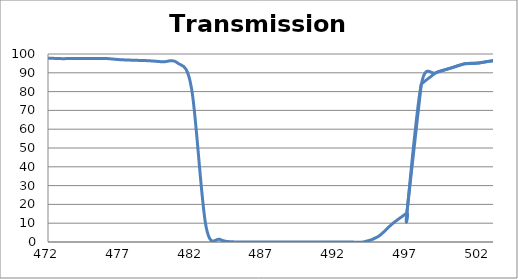
| Category | Transmission (%) |
|---|---|
| 2600.0 | 65.668 |
| 2599.0 | 65.684 |
| 2598.0 | 65.74 |
| 2597.0 | 65.794 |
| 2596.0 | 65.905 |
| 2595.0 | 66.047 |
| 2594.0 | 66.186 |
| 2593.0 | 66.374 |
| 2592.0 | 66.549 |
| 2591.0 | 66.769 |
| 2590.0 | 66.969 |
| 2589.0 | 67.181 |
| 2588.0 | 67.409 |
| 2587.0 | 67.704 |
| 2586.0 | 67.999 |
| 2585.0 | 68.207 |
| 2584.0 | 68.492 |
| 2583.0 | 68.764 |
| 2582.0 | 69.066 |
| 2581.0 | 69.389 |
| 2580.0 | 69.69 |
| 2579.0 | 69.988 |
| 2578.0 | 70.286 |
| 2577.0 | 70.584 |
| 2576.0 | 70.84 |
| 2575.0 | 71.145 |
| 2574.0 | 71.443 |
| 2573.0 | 71.683 |
| 2572.0 | 71.966 |
| 2571.0 | 72.23 |
| 2570.0 | 72.528 |
| 2569.0 | 72.798 |
| 2568.0 | 73.08 |
| 2567.0 | 73.34 |
| 2566.0 | 73.554 |
| 2565.0 | 73.762 |
| 2564.0 | 73.942 |
| 2563.0 | 74.112 |
| 2562.0 | 74.261 |
| 2561.0 | 74.375 |
| 2560.0 | 74.443 |
| 2559.0 | 74.502 |
| 2558.0 | 74.571 |
| 2557.0 | 74.596 |
| 2556.0 | 74.603 |
| 2555.0 | 74.603 |
| 2554.0 | 74.546 |
| 2553.0 | 74.491 |
| 2552.0 | 74.447 |
| 2551.0 | 74.345 |
| 2550.0 | 74.24 |
| 2549.0 | 74.157 |
| 2548.0 | 74.02 |
| 2547.0 | 73.843 |
| 2546.0 | 73.702 |
| 2545.0 | 73.576 |
| 2544.0 | 73.45 |
| 2543.0 | 73.312 |
| 2542.0 | 73.132 |
| 2541.0 | 72.984 |
| 2540.0 | 72.856 |
| 2539.0 | 72.773 |
| 2538.0 | 72.678 |
| 2537.0 | 72.597 |
| 2536.0 | 72.52 |
| 2535.0 | 72.45 |
| 2534.0 | 72.405 |
| 2533.0 | 72.385 |
| 2532.0 | 72.358 |
| 2531.0 | 72.353 |
| 2530.0 | 72.377 |
| 2529.0 | 72.429 |
| 2528.0 | 72.501 |
| 2527.0 | 72.619 |
| 2526.0 | 72.739 |
| 2525.0 | 72.878 |
| 2524.0 | 72.994 |
| 2523.0 | 73.16 |
| 2522.0 | 73.359 |
| 2521.0 | 73.58 |
| 2520.0 | 73.802 |
| 2519.0 | 74.068 |
| 2518.0 | 74.348 |
| 2517.0 | 74.641 |
| 2516.0 | 74.943 |
| 2515.0 | 75.262 |
| 2514.0 | 75.579 |
| 2513.0 | 75.898 |
| 2512.0 | 76.214 |
| 2511.0 | 76.527 |
| 2510.0 | 76.812 |
| 2509.0 | 77.129 |
| 2508.0 | 77.443 |
| 2507.0 | 77.738 |
| 2506.0 | 78.048 |
| 2505.0 | 78.302 |
| 2504.0 | 78.562 |
| 2503.0 | 78.792 |
| 2502.0 | 79.015 |
| 2501.0 | 79.195 |
| 2500.0 | 79.356 |
| 2499.0 | 79.455 |
| 2498.0 | 79.515 |
| 2497.0 | 79.581 |
| 2496.0 | 79.594 |
| 2495.0 | 79.607 |
| 2494.0 | 79.561 |
| 2493.0 | 79.493 |
| 2492.0 | 79.401 |
| 2491.0 | 79.265 |
| 2490.0 | 79.1 |
| 2489.0 | 78.941 |
| 2488.0 | 78.728 |
| 2487.0 | 78.483 |
| 2486.0 | 78.211 |
| 2485.0 | 77.928 |
| 2484.0 | 77.635 |
| 2483.0 | 77.314 |
| 2482.0 | 77.004 |
| 2481.0 | 76.682 |
| 2480.0 | 76.348 |
| 2479.0 | 76.006 |
| 2478.0 | 75.674 |
| 2477.0 | 75.333 |
| 2476.0 | 75.038 |
| 2475.0 | 74.734 |
| 2474.0 | 74.424 |
| 2473.0 | 74.117 |
| 2472.0 | 73.839 |
| 2471.0 | 73.573 |
| 2470.0 | 73.337 |
| 2469.0 | 73.155 |
| 2468.0 | 73.011 |
| 2467.0 | 72.866 |
| 2466.0 | 72.741 |
| 2465.0 | 72.637 |
| 2464.0 | 72.578 |
| 2463.0 | 72.577 |
| 2462.0 | 72.591 |
| 2461.0 | 72.631 |
| 2460.0 | 72.699 |
| 2459.0 | 72.811 |
| 2458.0 | 72.94 |
| 2457.0 | 73.11 |
| 2456.0 | 73.313 |
| 2455.0 | 73.518 |
| 2454.0 | 73.745 |
| 2453.0 | 74.009 |
| 2452.0 | 74.286 |
| 2451.0 | 74.601 |
| 2450.0 | 74.939 |
| 2449.0 | 75.282 |
| 2448.0 | 75.632 |
| 2447.0 | 75.988 |
| 2446.0 | 76.345 |
| 2445.0 | 76.72 |
| 2444.0 | 77.119 |
| 2443.0 | 77.505 |
| 2442.0 | 77.866 |
| 2441.0 | 78.23 |
| 2440.0 | 78.582 |
| 2439.0 | 78.904 |
| 2438.0 | 79.225 |
| 2437.0 | 79.519 |
| 2436.0 | 79.781 |
| 2435.0 | 80.007 |
| 2434.0 | 80.189 |
| 2433.0 | 80.339 |
| 2432.0 | 80.444 |
| 2431.0 | 80.52 |
| 2430.0 | 80.565 |
| 2429.0 | 80.544 |
| 2428.0 | 80.47 |
| 2427.0 | 80.347 |
| 2426.0 | 80.187 |
| 2425.0 | 80.012 |
| 2424.0 | 79.811 |
| 2423.0 | 79.557 |
| 2422.0 | 79.254 |
| 2421.0 | 78.933 |
| 2420.0 | 78.587 |
| 2419.0 | 78.217 |
| 2418.0 | 77.843 |
| 2417.0 | 77.45 |
| 2416.0 | 77.058 |
| 2415.0 | 76.661 |
| 2414.0 | 76.23 |
| 2413.0 | 75.806 |
| 2412.0 | 75.399 |
| 2411.0 | 75.019 |
| 2410.0 | 74.673 |
| 2409.0 | 74.315 |
| 2408.0 | 73.938 |
| 2407.0 | 73.595 |
| 2406.0 | 73.277 |
| 2405.0 | 72.981 |
| 2404.0 | 72.727 |
| 2403.0 | 72.512 |
| 2402.0 | 72.314 |
| 2401.0 | 72.12 |
| 2400.0 | 71.966 |
| 2399.0 | 71.87 |
| 2398.0 | 71.815 |
| 2397.0 | 71.79 |
| 2396.0 | 71.794 |
| 2395.0 | 71.832 |
| 2394.0 | 71.901 |
| 2393.0 | 72.006 |
| 2392.0 | 72.142 |
| 2391.0 | 72.322 |
| 2390.0 | 72.545 |
| 2389.0 | 72.805 |
| 2388.0 | 73.093 |
| 2387.0 | 73.394 |
| 2386.0 | 73.706 |
| 2385.0 | 74.043 |
| 2384.0 | 74.412 |
| 2383.0 | 74.787 |
| 2382.0 | 75.164 |
| 2381.0 | 75.565 |
| 2380.0 | 75.962 |
| 2379.0 | 76.368 |
| 2378.0 | 76.778 |
| 2377.0 | 77.186 |
| 2376.0 | 77.571 |
| 2375.0 | 77.932 |
| 2374.0 | 78.286 |
| 2373.0 | 78.638 |
| 2372.0 | 78.973 |
| 2371.0 | 79.287 |
| 2370.0 | 79.522 |
| 2369.0 | 79.723 |
| 2368.0 | 79.909 |
| 2367.0 | 80.077 |
| 2366.0 | 80.215 |
| 2365.0 | 80.334 |
| 2364.0 | 80.411 |
| 2363.0 | 80.437 |
| 2362.0 | 80.417 |
| 2361.0 | 80.37 |
| 2360.0 | 80.287 |
| 2359.0 | 80.184 |
| 2358.0 | 80.058 |
| 2357.0 | 79.887 |
| 2356.0 | 79.696 |
| 2355.0 | 79.484 |
| 2354.0 | 79.221 |
| 2353.0 | 78.97 |
| 2352.0 | 78.721 |
| 2351.0 | 78.455 |
| 2350.0 | 78.184 |
| 2349.0 | 77.905 |
| 2348.0 | 77.635 |
| 2347.0 | 77.384 |
| 2346.0 | 77.136 |
| 2345.0 | 76.896 |
| 2344.0 | 76.677 |
| 2343.0 | 76.468 |
| 2342.0 | 76.282 |
| 2341.0 | 76.125 |
| 2340.0 | 75.978 |
| 2339.0 | 75.867 |
| 2338.0 | 75.777 |
| 2337.0 | 75.701 |
| 2336.0 | 75.665 |
| 2335.0 | 75.641 |
| 2334.0 | 75.666 |
| 2333.0 | 75.715 |
| 2332.0 | 75.801 |
| 2331.0 | 75.889 |
| 2330.0 | 75.966 |
| 2329.0 | 76.085 |
| 2328.0 | 76.218 |
| 2327.0 | 76.397 |
| 2326.0 | 76.617 |
| 2325.0 | 76.819 |
| 2324.0 | 77.015 |
| 2323.0 | 77.222 |
| 2322.0 | 77.435 |
| 2321.0 | 77.662 |
| 2320.0 | 77.899 |
| 2319.0 | 78.158 |
| 2318.0 | 78.41 |
| 2317.0 | 78.622 |
| 2316.0 | 78.823 |
| 2315.0 | 78.999 |
| 2314.0 | 79.189 |
| 2313.0 | 79.346 |
| 2312.0 | 79.484 |
| 2311.0 | 79.628 |
| 2310.0 | 79.697 |
| 2309.0 | 79.741 |
| 2308.0 | 79.75 |
| 2307.0 | 79.758 |
| 2306.0 | 79.759 |
| 2305.0 | 79.703 |
| 2304.0 | 79.613 |
| 2303.0 | 79.542 |
| 2302.0 | 79.419 |
| 2301.0 | 79.265 |
| 2300.0 | 79.082 |
| 2299.0 | 78.914 |
| 2298.0 | 78.705 |
| 2297.0 | 78.472 |
| 2296.0 | 78.245 |
| 2295.0 | 78.013 |
| 2294.0 | 77.78 |
| 2293.0 | 77.56 |
| 2292.0 | 77.332 |
| 2291.0 | 77.077 |
| 2290.0 | 76.838 |
| 2289.0 | 76.574 |
| 2288.0 | 76.349 |
| 2287.0 | 76.118 |
| 2286.0 | 75.925 |
| 2285.0 | 75.739 |
| 2284.0 | 75.55 |
| 2283.0 | 75.338 |
| 2282.0 | 75.189 |
| 2281.0 | 75.037 |
| 2280.0 | 74.928 |
| 2279.0 | 74.804 |
| 2278.0 | 74.702 |
| 2277.0 | 74.629 |
| 2276.0 | 74.57 |
| 2275.0 | 74.517 |
| 2274.0 | 74.481 |
| 2273.0 | 74.467 |
| 2272.0 | 74.471 |
| 2271.0 | 74.454 |
| 2270.0 | 74.495 |
| 2269.0 | 74.492 |
| 2268.0 | 74.524 |
| 2267.0 | 74.583 |
| 2266.0 | 74.66 |
| 2265.0 | 74.712 |
| 2264.0 | 74.754 |
| 2263.0 | 74.83 |
| 2262.0 | 74.857 |
| 2261.0 | 74.913 |
| 2260.0 | 74.949 |
| 2259.0 | 74.973 |
| 2258.0 | 75.001 |
| 2257.0 | 75.016 |
| 2256.0 | 75.018 |
| 2255.0 | 75.04 |
| 2254.0 | 75.052 |
| 2253.0 | 75.081 |
| 2252.0 | 75.09 |
| 2251.0 | 75.042 |
| 2250.0 | 75.02 |
| 2249.0 | 74.996 |
| 2248.0 | 74.967 |
| 2247.0 | 74.963 |
| 2246.0 | 74.947 |
| 2245.0 | 74.889 |
| 2244.0 | 74.808 |
| 2243.0 | 74.766 |
| 2242.0 | 74.719 |
| 2241.0 | 74.674 |
| 2240.0 | 74.61 |
| 2239.0 | 74.554 |
| 2238.0 | 74.479 |
| 2237.0 | 74.382 |
| 2236.0 | 74.31 |
| 2235.0 | 74.235 |
| 2234.0 | 74.141 |
| 2233.0 | 74.039 |
| 2232.0 | 73.905 |
| 2231.0 | 73.759 |
| 2230.0 | 73.624 |
| 2229.0 | 73.452 |
| 2228.0 | 73.281 |
| 2227.0 | 73.106 |
| 2226.0 | 72.911 |
| 2225.0 | 72.695 |
| 2224.0 | 72.451 |
| 2223.0 | 72.182 |
| 2222.0 | 71.929 |
| 2221.0 | 71.682 |
| 2220.0 | 71.411 |
| 2219.0 | 71.13 |
| 2218.0 | 70.876 |
| 2217.0 | 70.608 |
| 2216.0 | 70.393 |
| 2215.0 | 70.158 |
| 2214.0 | 69.957 |
| 2213.0 | 69.779 |
| 2212.0 | 69.646 |
| 2211.0 | 69.523 |
| 2210.0 | 69.44 |
| 2209.0 | 69.437 |
| 2208.0 | 69.509 |
| 2207.0 | 69.62 |
| 2206.0 | 69.799 |
| 2205.0 | 70.027 |
| 2204.0 | 70.287 |
| 2203.0 | 70.636 |
| 2202.0 | 71.03 |
| 2201.0 | 71.459 |
| 2200.0 | 71.949 |
| 2199.0 | 72.453 |
| 2198.0 | 72.921 |
| 2197.0 | 73.437 |
| 2196.0 | 73.984 |
| 2195.0 | 74.483 |
| 2194.0 | 74.942 |
| 2193.0 | 75.407 |
| 2192.0 | 75.798 |
| 2191.0 | 76.24 |
| 2190.0 | 76.62 |
| 2189.0 | 77.04 |
| 2188.0 | 77.394 |
| 2187.0 | 77.769 |
| 2186.0 | 78.088 |
| 2185.0 | 78.403 |
| 2184.0 | 78.724 |
| 2183.0 | 79.033 |
| 2182.0 | 79.329 |
| 2181.0 | 79.635 |
| 2180.0 | 79.872 |
| 2179.0 | 80.127 |
| 2178.0 | 80.356 |
| 2177.0 | 80.603 |
| 2176.0 | 80.773 |
| 2175.0 | 80.943 |
| 2174.0 | 81.101 |
| 2173.0 | 81.223 |
| 2172.0 | 81.293 |
| 2171.0 | 81.336 |
| 2170.0 | 81.362 |
| 2169.0 | 81.354 |
| 2168.0 | 81.332 |
| 2167.0 | 81.277 |
| 2166.0 | 81.142 |
| 2165.0 | 80.98 |
| 2164.0 | 80.777 |
| 2163.0 | 80.548 |
| 2162.0 | 80.275 |
| 2161.0 | 79.961 |
| 2160.0 | 79.627 |
| 2159.0 | 79.245 |
| 2158.0 | 78.893 |
| 2157.0 | 78.51 |
| 2156.0 | 78.103 |
| 2155.0 | 77.69 |
| 2154.0 | 77.241 |
| 2153.0 | 76.831 |
| 2152.0 | 76.452 |
| 2151.0 | 76.052 |
| 2150.0 | 75.695 |
| 2149.0 | 75.327 |
| 2148.0 | 75.031 |
| 2147.0 | 74.747 |
| 2146.0 | 74.483 |
| 2145.0 | 74.26 |
| 2144.0 | 74.089 |
| 2143.0 | 73.972 |
| 2142.0 | 73.845 |
| 2141.0 | 73.766 |
| 2140.0 | 73.753 |
| 2139.0 | 73.754 |
| 2138.0 | 73.834 |
| 2137.0 | 73.928 |
| 2136.0 | 74.047 |
| 2135.0 | 74.218 |
| 2134.0 | 74.427 |
| 2133.0 | 74.636 |
| 2132.0 | 74.886 |
| 2131.0 | 75.17 |
| 2130.0 | 75.484 |
| 2129.0 | 75.755 |
| 2128.0 | 76.033 |
| 2127.0 | 76.312 |
| 2126.0 | 76.631 |
| 2125.0 | 76.982 |
| 2124.0 | 77.257 |
| 2123.0 | 77.508 |
| 2122.0 | 77.75 |
| 2121.0 | 77.967 |
| 2120.0 | 78.139 |
| 2119.0 | 78.25 |
| 2118.0 | 78.327 |
| 2117.0 | 78.381 |
| 2116.0 | 78.333 |
| 2115.0 | 78.265 |
| 2114.0 | 78.133 |
| 2113.0 | 77.955 |
| 2112.0 | 77.753 |
| 2111.0 | 77.489 |
| 2110.0 | 77.206 |
| 2109.0 | 76.863 |
| 2108.0 | 76.499 |
| 2107.0 | 76.132 |
| 2106.0 | 75.786 |
| 2105.0 | 75.396 |
| 2104.0 | 75.026 |
| 2103.0 | 74.631 |
| 2102.0 | 74.28 |
| 2101.0 | 73.951 |
| 2100.0 | 73.668 |
| 2099.0 | 73.406 |
| 2098.0 | 73.187 |
| 2097.0 | 72.988 |
| 2096.0 | 72.863 |
| 2095.0 | 72.768 |
| 2094.0 | 72.744 |
| 2093.0 | 72.778 |
| 2092.0 | 72.842 |
| 2091.0 | 72.946 |
| 2090.0 | 73.11 |
| 2089.0 | 73.337 |
| 2088.0 | 73.581 |
| 2087.0 | 73.88 |
| 2086.0 | 74.223 |
| 2085.0 | 74.621 |
| 2084.0 | 75.032 |
| 2083.0 | 75.495 |
| 2082.0 | 75.916 |
| 2081.0 | 76.379 |
| 2080.0 | 76.861 |
| 2079.0 | 77.328 |
| 2078.0 | 77.766 |
| 2077.0 | 78.173 |
| 2076.0 | 78.551 |
| 2075.0 | 78.884 |
| 2074.0 | 79.144 |
| 2073.0 | 79.345 |
| 2072.0 | 79.482 |
| 2071.0 | 79.532 |
| 2070.0 | 79.486 |
| 2069.0 | 79.382 |
| 2068.0 | 79.182 |
| 2067.0 | 78.9 |
| 2066.0 | 78.563 |
| 2065.0 | 78.164 |
| 2064.0 | 77.702 |
| 2063.0 | 77.195 |
| 2062.0 | 76.643 |
| 2061.0 | 76.087 |
| 2060.0 | 75.527 |
| 2059.0 | 74.936 |
| 2058.0 | 74.354 |
| 2057.0 | 73.763 |
| 2056.0 | 73.213 |
| 2055.0 | 72.724 |
| 2054.0 | 72.28 |
| 2053.0 | 71.877 |
| 2052.0 | 71.514 |
| 2051.0 | 71.207 |
| 2050.0 | 70.974 |
| 2049.0 | 70.807 |
| 2048.0 | 70.706 |
| 2047.0 | 70.681 |
| 2046.0 | 70.728 |
| 2045.0 | 70.828 |
| 2044.0 | 70.99 |
| 2043.0 | 71.229 |
| 2042.0 | 71.564 |
| 2041.0 | 71.964 |
| 2040.0 | 72.373 |
| 2039.0 | 72.804 |
| 2038.0 | 73.291 |
| 2037.0 | 73.838 |
| 2036.0 | 74.394 |
| 2035.0 | 74.951 |
| 2034.0 | 75.496 |
| 2033.0 | 75.995 |
| 2032.0 | 76.455 |
| 2031.0 | 76.88 |
| 2030.0 | 77.24 |
| 2029.0 | 77.514 |
| 2028.0 | 77.678 |
| 2027.0 | 77.752 |
| 2026.0 | 77.738 |
| 2025.0 | 77.61 |
| 2024.0 | 77.377 |
| 2023.0 | 77.023 |
| 2022.0 | 76.601 |
| 2021.0 | 76.101 |
| 2020.0 | 75.484 |
| 2019.0 | 74.814 |
| 2018.0 | 74.086 |
| 2017.0 | 73.353 |
| 2016.0 | 72.628 |
| 2015.0 | 71.869 |
| 2014.0 | 71.135 |
| 2013.0 | 70.429 |
| 2012.0 | 69.724 |
| 2011.0 | 69.092 |
| 2010.0 | 68.511 |
| 2009.0 | 67.971 |
| 2008.0 | 67.482 |
| 2007.0 | 67.081 |
| 2006.0 | 66.787 |
| 2005.0 | 66.577 |
| 2004.0 | 66.451 |
| 2003.0 | 66.411 |
| 2002.0 | 66.443 |
| 2001.0 | 66.57 |
| 2000.0 | 66.825 |
| 1999.0 | 67.154 |
| 1998.0 | 67.552 |
| 1997.0 | 68.035 |
| 1996.0 | 68.593 |
| 1995.0 | 69.219 |
| 1994.0 | 69.916 |
| 1993.0 | 70.61 |
| 1992.0 | 71.302 |
| 1991.0 | 72.007 |
| 1990.0 | 72.705 |
| 1989.0 | 73.356 |
| 1988.0 | 73.923 |
| 1987.0 | 74.413 |
| 1986.0 | 74.78 |
| 1985.0 | 75.044 |
| 1984.0 | 75.189 |
| 1983.0 | 75.171 |
| 1982.0 | 75.013 |
| 1981.0 | 74.716 |
| 1980.0 | 74.256 |
| 1979.0 | 73.673 |
| 1978.0 | 72.961 |
| 1977.0 | 72.16 |
| 1976.0 | 71.307 |
| 1975.0 | 70.389 |
| 1974.0 | 69.395 |
| 1973.0 | 68.4 |
| 1972.0 | 67.378 |
| 1971.0 | 66.396 |
| 1970.0 | 65.437 |
| 1969.0 | 64.462 |
| 1968.0 | 63.603 |
| 1967.0 | 62.855 |
| 1966.0 | 62.152 |
| 1965.0 | 61.512 |
| 1964.0 | 60.993 |
| 1963.0 | 60.61 |
| 1962.0 | 60.305 |
| 1961.0 | 60.127 |
| 1960.0 | 60.089 |
| 1959.0 | 60.185 |
| 1958.0 | 60.365 |
| 1957.0 | 60.717 |
| 1956.0 | 61.168 |
| 1955.0 | 61.759 |
| 1954.0 | 62.504 |
| 1953.0 | 63.325 |
| 1952.0 | 64.228 |
| 1951.0 | 65.226 |
| 1950.0 | 66.382 |
| 1949.0 | 67.595 |
| 1948.0 | 68.763 |
| 1947.0 | 70.041 |
| 1946.0 | 71.328 |
| 1945.0 | 72.52 |
| 1944.0 | 73.735 |
| 1943.0 | 74.823 |
| 1942.0 | 75.745 |
| 1941.0 | 76.58 |
| 1940.0 | 77.257 |
| 1939.0 | 77.733 |
| 1938.0 | 78.002 |
| 1937.0 | 78.089 |
| 1936.0 | 78.019 |
| 1935.0 | 77.768 |
| 1934.0 | 77.332 |
| 1933.0 | 76.784 |
| 1932.0 | 76.084 |
| 1931.0 | 75.309 |
| 1930.0 | 74.48 |
| 1929.0 | 73.555 |
| 1928.0 | 72.573 |
| 1927.0 | 71.614 |
| 1926.0 | 70.672 |
| 1925.0 | 69.784 |
| 1924.0 | 69.03 |
| 1923.0 | 68.365 |
| 1922.0 | 67.773 |
| 1921.0 | 67.186 |
| 1920.0 | 66.686 |
| 1919.0 | 66.328 |
| 1918.0 | 66.101 |
| 1917.0 | 66.054 |
| 1916.0 | 66.182 |
| 1915.0 | 66.422 |
| 1914.0 | 66.701 |
| 1913.0 | 67.066 |
| 1912.0 | 67.468 |
| 1911.0 | 67.966 |
| 1910.0 | 68.59 |
| 1909.0 | 69.235 |
| 1908.0 | 69.917 |
| 1907.0 | 70.622 |
| 1906.0 | 71.406 |
| 1905.0 | 72.031 |
| 1904.0 | 72.634 |
| 1903.0 | 73.125 |
| 1902.0 | 73.596 |
| 1901.0 | 73.953 |
| 1900.0 | 74.186 |
| 1899.0 | 74.284 |
| 1898.0 | 74.216 |
| 1897.0 | 74.049 |
| 1896.0 | 73.842 |
| 1895.0 | 73.58 |
| 1894.0 | 73.238 |
| 1893.0 | 72.776 |
| 1892.0 | 72.196 |
| 1891.0 | 71.53 |
| 1890.0 | 70.83 |
| 1889.0 | 70.18 |
| 1888.0 | 69.601 |
| 1887.0 | 69.136 |
| 1886.0 | 68.728 |
| 1885.0 | 68.347 |
| 1884.0 | 68.001 |
| 1883.0 | 67.697 |
| 1882.0 | 67.556 |
| 1881.0 | 67.513 |
| 1880.0 | 67.587 |
| 1879.0 | 67.835 |
| 1878.0 | 68.161 |
| 1877.0 | 68.652 |
| 1876.0 | 69.173 |
| 1875.0 | 69.792 |
| 1874.0 | 70.5 |
| 1873.0 | 71.316 |
| 1872.0 | 72.194 |
| 1871.0 | 73.04 |
| 1870.0 | 73.936 |
| 1869.0 | 74.881 |
| 1868.0 | 75.687 |
| 1867.0 | 76.447 |
| 1866.0 | 77.036 |
| 1865.0 | 77.549 |
| 1864.0 | 77.874 |
| 1863.0 | 78.126 |
| 1862.0 | 78.17 |
| 1861.0 | 78.024 |
| 1860.0 | 77.619 |
| 1859.0 | 77.131 |
| 1858.0 | 76.512 |
| 1857.0 | 75.818 |
| 1856.0 | 75.081 |
| 1855.0 | 74.251 |
| 1854.0 | 73.433 |
| 1853.0 | 72.555 |
| 1852.0 | 71.7 |
| 1851.0 | 70.897 |
| 1850.0 | 70.329 |
| 1849.0 | 69.826 |
| 1848.0 | 69.312 |
| 1847.0 | 68.76 |
| 1846.0 | 68.371 |
| 1845.0 | 68.191 |
| 1844.0 | 68.25 |
| 1843.0 | 68.532 |
| 1842.0 | 68.973 |
| 1841.0 | 69.434 |
| 1840.0 | 70.051 |
| 1839.0 | 70.696 |
| 1838.0 | 71.469 |
| 1837.0 | 72.413 |
| 1836.0 | 73.612 |
| 1835.0 | 74.806 |
| 1834.0 | 75.888 |
| 1833.0 | 76.911 |
| 1832.0 | 77.939 |
| 1831.0 | 78.846 |
| 1830.0 | 79.611 |
| 1829.0 | 80.2 |
| 1828.0 | 80.477 |
| 1827.0 | 80.516 |
| 1826.0 | 80.303 |
| 1825.0 | 79.882 |
| 1824.0 | 79.153 |
| 1823.0 | 78.42 |
| 1822.0 | 77.413 |
| 1821.0 | 76.006 |
| 1820.0 | 74.417 |
| 1819.0 | 72.777 |
| 1818.0 | 71.307 |
| 1817.0 | 69.949 |
| 1816.0 | 68.521 |
| 1815.0 | 67.139 |
| 1814.0 | 65.847 |
| 1813.0 | 64.69 |
| 1812.0 | 63.616 |
| 1811.0 | 62.69 |
| 1810.0 | 61.85 |
| 1809.0 | 61.175 |
| 1808.0 | 60.754 |
| 1807.0 | 60.426 |
| 1806.0 | 60.236 |
| 1805.0 | 60.175 |
| 1804.0 | 60.248 |
| 1803.0 | 60.442 |
| 1802.0 | 60.755 |
| 1801.0 | 61.234 |
| 1800.0 | 61.786 |
| 1799.0 | 62.359 |
| 1798.0 | 62.982 |
| 1797.0 | 63.637 |
| 1796.0 | 64.226 |
| 1795.0 | 64.818 |
| 1794.0 | 65.339 |
| 1793.0 | 65.742 |
| 1792.0 | 66.046 |
| 1791.0 | 66.214 |
| 1790.0 | 66.214 |
| 1789.0 | 66.049 |
| 1788.0 | 65.74 |
| 1787.0 | 65.292 |
| 1786.0 | 64.747 |
| 1785.0 | 64.049 |
| 1784.0 | 63.314 |
| 1783.0 | 62.589 |
| 1782.0 | 61.814 |
| 1781.0 | 61.111 |
| 1780.0 | 60.439 |
| 1779.0 | 59.795 |
| 1778.0 | 59.25 |
| 1777.0 | 58.858 |
| 1776.0 | 58.606 |
| 1775.0 | 58.469 |
| 1774.0 | 58.502 |
| 1773.0 | 58.665 |
| 1772.0 | 58.986 |
| 1771.0 | 59.456 |
| 1770.0 | 60.1 |
| 1769.0 | 60.931 |
| 1768.0 | 61.905 |
| 1767.0 | 63.047 |
| 1766.0 | 64.348 |
| 1765.0 | 65.75 |
| 1764.0 | 67.262 |
| 1763.0 | 68.83 |
| 1762.0 | 70.424 |
| 1761.0 | 72.059 |
| 1760.0 | 73.65 |
| 1759.0 | 75.048 |
| 1758.0 | 76.316 |
| 1757.0 | 77.356 |
| 1756.0 | 78.092 |
| 1755.0 | 78.536 |
| 1754.0 | 78.682 |
| 1753.0 | 78.498 |
| 1752.0 | 78.019 |
| 1751.0 | 77.249 |
| 1750.0 | 76.276 |
| 1749.0 | 75.131 |
| 1748.0 | 73.877 |
| 1747.0 | 72.591 |
| 1746.0 | 71.284 |
| 1745.0 | 70.004 |
| 1744.0 | 68.76 |
| 1743.0 | 67.707 |
| 1742.0 | 66.763 |
| 1741.0 | 65.994 |
| 1740.0 | 65.391 |
| 1739.0 | 65.022 |
| 1738.0 | 64.773 |
| 1737.0 | 64.738 |
| 1736.0 | 64.916 |
| 1735.0 | 65.256 |
| 1734.0 | 65.772 |
| 1733.0 | 66.501 |
| 1732.0 | 67.404 |
| 1731.0 | 68.424 |
| 1730.0 | 69.666 |
| 1729.0 | 71.076 |
| 1728.0 | 72.628 |
| 1727.0 | 74.28 |
| 1726.0 | 76.017 |
| 1725.0 | 77.742 |
| 1724.0 | 79.532 |
| 1723.0 | 81.346 |
| 1722.0 | 83.107 |
| 1721.0 | 84.74 |
| 1720.0 | 86.3 |
| 1719.0 | 87.687 |
| 1718.0 | 88.922 |
| 1717.0 | 89.976 |
| 1716.0 | 90.817 |
| 1715.0 | 91.487 |
| 1714.0 | 91.993 |
| 1713.0 | 92.285 |
| 1712.0 | 92.404 |
| 1711.0 | 92.38 |
| 1710.0 | 92.208 |
| 1709.0 | 91.98 |
| 1708.0 | 91.652 |
| 1707.0 | 91.255 |
| 1706.0 | 90.823 |
| 1705.0 | 90.295 |
| 1704.0 | 89.717 |
| 1703.0 | 89.09 |
| 1702.0 | 88.41 |
| 1701.0 | 87.707 |
| 1700.0 | 86.95 |
| 1699.0 | 86.154 |
| 1698.0 | 85.308 |
| 1697.0 | 84.449 |
| 1696.0 | 83.544 |
| 1695.0 | 82.655 |
| 1694.0 | 81.807 |
| 1693.0 | 80.933 |
| 1692.0 | 80.081 |
| 1691.0 | 79.272 |
| 1690.0 | 78.526 |
| 1689.0 | 77.875 |
| 1688.0 | 77.325 |
| 1687.0 | 76.891 |
| 1686.0 | 76.591 |
| 1685.0 | 76.471 |
| 1684.0 | 76.521 |
| 1683.0 | 76.713 |
| 1682.0 | 77.12 |
| 1681.0 | 77.71 |
| 1680.0 | 78.481 |
| 1679.0 | 79.445 |
| 1678.0 | 80.588 |
| 1677.0 | 81.905 |
| 1676.0 | 83.351 |
| 1675.0 | 84.872 |
| 1674.0 | 86.44 |
| 1673.0 | 87.967 |
| 1672.0 | 89.353 |
| 1671.0 | 90.642 |
| 1670.0 | 91.721 |
| 1669.0 | 92.543 |
| 1668.0 | 93.033 |
| 1667.0 | 93.094 |
| 1666.0 | 92.807 |
| 1665.0 | 92.171 |
| 1664.0 | 91.174 |
| 1663.0 | 89.917 |
| 1662.0 | 88.474 |
| 1661.0 | 86.907 |
| 1660.0 | 85.298 |
| 1659.0 | 83.653 |
| 1658.0 | 82.041 |
| 1657.0 | 80.547 |
| 1656.0 | 79.25 |
| 1655.0 | 78.179 |
| 1654.0 | 77.28 |
| 1653.0 | 76.622 |
| 1652.0 | 76.204 |
| 1651.0 | 76.047 |
| 1650.0 | 76.169 |
| 1649.0 | 76.57 |
| 1648.0 | 77.24 |
| 1647.0 | 78.152 |
| 1646.0 | 79.264 |
| 1645.0 | 80.585 |
| 1644.0 | 82.1 |
| 1643.0 | 83.753 |
| 1642.0 | 85.474 |
| 1641.0 | 87.204 |
| 1640.0 | 88.866 |
| 1639.0 | 90.344 |
| 1638.0 | 91.559 |
| 1637.0 | 92.475 |
| 1636.0 | 93.036 |
| 1635.0 | 93.203 |
| 1634.0 | 92.979 |
| 1633.0 | 92.359 |
| 1632.0 | 91.452 |
| 1631.0 | 90.311 |
| 1630.0 | 88.966 |
| 1629.0 | 87.541 |
| 1628.0 | 86.119 |
| 1627.0 | 84.735 |
| 1626.0 | 83.45 |
| 1625.0 | 82.382 |
| 1624.0 | 81.564 |
| 1623.0 | 80.949 |
| 1622.0 | 80.568 |
| 1621.0 | 80.454 |
| 1620.0 | 80.592 |
| 1619.0 | 80.962 |
| 1618.0 | 81.542 |
| 1617.0 | 82.33 |
| 1616.0 | 83.284 |
| 1615.0 | 84.373 |
| 1614.0 | 85.475 |
| 1613.0 | 86.625 |
| 1612.0 | 87.694 |
| 1611.0 | 88.633 |
| 1610.0 | 89.434 |
| 1609.0 | 89.96 |
| 1608.0 | 90.172 |
| 1607.0 | 90.087 |
| 1606.0 | 89.722 |
| 1605.0 | 89.071 |
| 1604.0 | 88.128 |
| 1603.0 | 86.96 |
| 1602.0 | 85.646 |
| 1601.0 | 84.229 |
| 1600.0 | 82.834 |
| 1599.0 | 81.462 |
| 1598.0 | 80.177 |
| 1597.0 | 79.082 |
| 1596.0 | 78.186 |
| 1595.0 | 77.506 |
| 1594.0 | 77.059 |
| 1593.0 | 76.872 |
| 1592.0 | 76.902 |
| 1591.0 | 77.175 |
| 1590.0 | 77.693 |
| 1589.0 | 78.425 |
| 1588.0 | 79.315 |
| 1587.0 | 80.415 |
| 1586.0 | 81.497 |
| 1585.0 | 82.638 |
| 1584.0 | 83.776 |
| 1583.0 | 84.858 |
| 1582.0 | 85.848 |
| 1581.0 | 86.7 |
| 1580.0 | 87.352 |
| 1579.0 | 87.838 |
| 1578.0 | 88.117 |
| 1577.0 | 88.217 |
| 1576.0 | 88.201 |
| 1575.0 | 88.037 |
| 1574.0 | 87.763 |
| 1573.0 | 87.427 |
| 1572.0 | 87.106 |
| 1571.0 | 86.853 |
| 1570.0 | 86.665 |
| 1569.0 | 86.526 |
| 1568.0 | 86.478 |
| 1567.0 | 86.578 |
| 1566.0 | 86.784 |
| 1565.0 | 87.134 |
| 1564.0 | 87.579 |
| 1563.0 | 88.083 |
| 1562.0 | 88.63 |
| 1561.0 | 89.165 |
| 1560.0 | 89.713 |
| 1559.0 | 90.175 |
| 1558.0 | 90.524 |
| 1557.0 | 90.716 |
| 1556.0 | 90.764 |
| 1555.0 | 90.652 |
| 1554.0 | 90.382 |
| 1553.0 | 89.963 |
| 1552.0 | 89.419 |
| 1551.0 | 88.832 |
| 1550.0 | 88.186 |
| 1549.0 | 87.565 |
| 1548.0 | 87.015 |
| 1547.0 | 86.554 |
| 1546.0 | 86.222 |
| 1545.0 | 86.021 |
| 1544.0 | 85.994 |
| 1543.0 | 86.077 |
| 1542.0 | 86.283 |
| 1541.0 | 86.598 |
| 1540.0 | 86.968 |
| 1539.0 | 87.404 |
| 1538.0 | 87.806 |
| 1537.0 | 88.104 |
| 1536.0 | 88.281 |
| 1535.0 | 88.288 |
| 1534.0 | 88.09 |
| 1533.0 | 87.674 |
| 1532.0 | 87.017 |
| 1531.0 | 86.175 |
| 1530.0 | 85.158 |
| 1529.0 | 83.89 |
| 1528.0 | 82.549 |
| 1527.0 | 81.111 |
| 1526.0 | 79.773 |
| 1525.0 | 78.476 |
| 1524.0 | 77.291 |
| 1523.0 | 76.287 |
| 1522.0 | 75.509 |
| 1521.0 | 74.967 |
| 1520.0 | 74.698 |
| 1519.0 | 74.743 |
| 1518.0 | 75.056 |
| 1517.0 | 75.621 |
| 1516.0 | 76.427 |
| 1515.0 | 77.444 |
| 1514.0 | 78.628 |
| 1513.0 | 79.94 |
| 1512.0 | 81.255 |
| 1511.0 | 82.474 |
| 1510.0 | 83.544 |
| 1509.0 | 84.408 |
| 1508.0 | 84.927 |
| 1507.0 | 85.049 |
| 1506.0 | 84.847 |
| 1505.0 | 84.336 |
| 1504.0 | 83.499 |
| 1503.0 | 82.419 |
| 1502.0 | 81.186 |
| 1501.0 | 79.865 |
| 1500.0 | 78.571 |
| 1499.0 | 77.376 |
| 1498.0 | 76.332 |
| 1497.0 | 75.455 |
| 1496.0 | 74.835 |
| 1495.0 | 74.446 |
| 1494.0 | 74.333 |
| 1493.0 | 74.482 |
| 1492.0 | 74.862 |
| 1491.0 | 75.487 |
| 1490.0 | 76.293 |
| 1489.0 | 77.264 |
| 1488.0 | 78.299 |
| 1487.0 | 79.415 |
| 1486.0 | 80.517 |
| 1485.0 | 81.566 |
| 1484.0 | 82.39 |
| 1483.0 | 83.025 |
| 1482.0 | 83.372 |
| 1481.0 | 83.446 |
| 1480.0 | 83.275 |
| 1479.0 | 82.81 |
| 1478.0 | 82.21 |
| 1477.0 | 81.484 |
| 1476.0 | 80.69 |
| 1475.0 | 79.866 |
| 1474.0 | 79.123 |
| 1473.0 | 78.554 |
| 1472.0 | 78.123 |
| 1471.0 | 77.811 |
| 1470.0 | 77.649 |
| 1469.0 | 77.664 |
| 1468.0 | 77.776 |
| 1467.0 | 78.101 |
| 1466.0 | 78.434 |
| 1465.0 | 78.809 |
| 1464.0 | 79.108 |
| 1463.0 | 79.348 |
| 1462.0 | 79.505 |
| 1461.0 | 79.501 |
| 1460.0 | 79.369 |
| 1459.0 | 79.096 |
| 1458.0 | 78.683 |
| 1457.0 | 78.151 |
| 1456.0 | 77.546 |
| 1455.0 | 76.972 |
| 1454.0 | 76.392 |
| 1453.0 | 75.841 |
| 1452.0 | 75.373 |
| 1451.0 | 74.983 |
| 1450.0 | 74.686 |
| 1449.0 | 74.487 |
| 1448.0 | 74.376 |
| 1447.0 | 74.324 |
| 1446.0 | 74.358 |
| 1445.0 | 74.289 |
| 1444.0 | 74.164 |
| 1443.0 | 73.991 |
| 1442.0 | 73.686 |
| 1441.0 | 73.246 |
| 1440.0 | 72.675 |
| 1439.0 | 71.916 |
| 1438.0 | 71.109 |
| 1437.0 | 70.161 |
| 1436.0 | 69.17 |
| 1435.0 | 68.268 |
| 1434.0 | 67.447 |
| 1433.0 | 66.731 |
| 1432.0 | 66.238 |
| 1431.0 | 65.886 |
| 1430.0 | 65.775 |
| 1429.0 | 65.891 |
| 1428.0 | 66.256 |
| 1427.0 | 66.8 |
| 1426.0 | 67.512 |
| 1425.0 | 68.307 |
| 1424.0 | 69.121 |
| 1423.0 | 69.874 |
| 1422.0 | 70.497 |
| 1421.0 | 70.898 |
| 1420.0 | 71.011 |
| 1419.0 | 70.787 |
| 1418.0 | 70.094 |
| 1417.0 | 69.138 |
| 1416.0 | 68.068 |
| 1415.0 | 66.91 |
| 1414.0 | 65.514 |
| 1413.0 | 63.923 |
| 1412.0 | 62.494 |
| 1411.0 | 61.289 |
| 1410.0 | 60.313 |
| 1409.0 | 59.518 |
| 1408.0 | 58.905 |
| 1407.0 | 58.532 |
| 1406.0 | 58.498 |
| 1405.0 | 58.78 |
| 1404.0 | 59.354 |
| 1403.0 | 60.149 |
| 1402.0 | 61.12 |
| 1401.0 | 62.289 |
| 1400.0 | 63.449 |
| 1399.0 | 64.616 |
| 1398.0 | 65.485 |
| 1397.0 | 66.353 |
| 1396.0 | 67.165 |
| 1395.0 | 67.438 |
| 1394.0 | 67.364 |
| 1393.0 | 67.098 |
| 1392.0 | 66.719 |
| 1391.0 | 66.101 |
| 1390.0 | 65.498 |
| 1389.0 | 64.946 |
| 1388.0 | 64.408 |
| 1387.0 | 63.866 |
| 1386.0 | 63.467 |
| 1385.0 | 63.291 |
| 1384.0 | 63.298 |
| 1383.0 | 63.483 |
| 1382.0 | 63.67 |
| 1381.0 | 63.85 |
| 1380.0 | 64.105 |
| 1379.0 | 64.388 |
| 1378.0 | 64.729 |
| 1377.0 | 64.994 |
| 1376.0 | 65.151 |
| 1375.0 | 65.207 |
| 1374.0 | 65.146 |
| 1373.0 | 65.043 |
| 1372.0 | 64.921 |
| 1371.0 | 64.756 |
| 1370.0 | 64.623 |
| 1369.0 | 64.537 |
| 1368.0 | 64.554 |
| 1367.0 | 64.613 |
| 1366.0 | 64.672 |
| 1365.0 | 64.757 |
| 1364.0 | 64.815 |
| 1363.0 | 64.779 |
| 1362.0 | 64.557 |
| 1361.0 | 64.038 |
| 1360.0 | 63.273 |
| 1359.0 | 62.253 |
| 1358.0 | 61.076 |
| 1357.0 | 59.821 |
| 1356.0 | 58.414 |
| 1355.0 | 57.063 |
| 1354.0 | 55.64 |
| 1353.0 | 54.304 |
| 1352.0 | 53.309 |
| 1351.0 | 52.563 |
| 1350.0 | 52.239 |
| 1349.0 | 52.23 |
| 1348.0 | 52.476 |
| 1347.0 | 53.007 |
| 1346.0 | 53.77 |
| 1345.0 | 54.788 |
| 1344.0 | 55.97 |
| 1343.0 | 57.105 |
| 1342.0 | 58.106 |
| 1341.0 | 58.933 |
| 1340.0 | 59.462 |
| 1339.0 | 59.58 |
| 1338.0 | 59.281 |
| 1337.0 | 58.605 |
| 1336.0 | 57.616 |
| 1335.0 | 56.401 |
| 1334.0 | 55.112 |
| 1333.0 | 53.816 |
| 1332.0 | 52.721 |
| 1331.0 | 51.731 |
| 1330.0 | 50.999 |
| 1329.0 | 50.522 |
| 1328.0 | 50.339 |
| 1327.0 | 50.422 |
| 1326.0 | 50.755 |
| 1325.0 | 51.317 |
| 1324.0 | 52.021 |
| 1323.0 | 52.808 |
| 1322.0 | 53.629 |
| 1321.0 | 54.374 |
| 1320.0 | 54.978 |
| 1319.0 | 55.343 |
| 1318.0 | 55.456 |
| 1317.0 | 55.349 |
| 1316.0 | 55.047 |
| 1315.0 | 54.643 |
| 1314.0 | 54.204 |
| 1313.0 | 53.801 |
| 1312.0 | 53.503 |
| 1311.0 | 53.329 |
| 1310.0 | 53.309 |
| 1309.0 | 53.47 |
| 1308.0 | 53.788 |
| 1307.0 | 54.216 |
| 1306.0 | 54.657 |
| 1305.0 | 55.065 |
| 1304.0 | 55.364 |
| 1303.0 | 55.548 |
| 1302.0 | 55.559 |
| 1301.0 | 55.403 |
| 1300.0 | 55.102 |
| 1299.0 | 54.671 |
| 1298.0 | 54.217 |
| 1297.0 | 53.767 |
| 1296.0 | 53.362 |
| 1295.0 | 53.07 |
| 1294.0 | 52.915 |
| 1293.0 | 52.87 |
| 1292.0 | 52.951 |
| 1291.0 | 53.157 |
| 1290.0 | 53.411 |
| 1289.0 | 53.639 |
| 1288.0 | 53.761 |
| 1287.0 | 53.7 |
| 1286.0 | 53.405 |
| 1285.0 | 52.841 |
| 1284.0 | 52.055 |
| 1283.0 | 51.092 |
| 1282.0 | 50.016 |
| 1281.0 | 48.949 |
| 1280.0 | 47.956 |
| 1279.0 | 47.112 |
| 1278.0 | 46.549 |
| 1277.0 | 46.234 |
| 1276.0 | 46.169 |
| 1275.0 | 46.331 |
| 1274.0 | 46.691 |
| 1273.0 | 47.149 |
| 1272.0 | 47.602 |
| 1271.0 | 47.956 |
| 1270.0 | 48.085 |
| 1269.0 | 47.909 |
| 1268.0 | 47.401 |
| 1267.0 | 46.603 |
| 1266.0 | 45.55 |
| 1265.0 | 44.34 |
| 1264.0 | 43.176 |
| 1263.0 | 42.142 |
| 1262.0 | 41.245 |
| 1261.0 | 40.595 |
| 1260.0 | 40.223 |
| 1259.0 | 40.09 |
| 1258.0 | 40.211 |
| 1257.0 | 40.548 |
| 1256.0 | 41.007 |
| 1255.0 | 41.505 |
| 1254.0 | 41.932 |
| 1253.0 | 42.139 |
| 1252.0 | 42.037 |
| 1251.0 | 41.597 |
| 1250.0 | 40.827 |
| 1249.0 | 39.804 |
| 1248.0 | 38.61 |
| 1247.0 | 37.388 |
| 1246.0 | 36.263 |
| 1245.0 | 35.31 |
| 1244.0 | 34.624 |
| 1243.0 | 34.269 |
| 1242.0 | 34.287 |
| 1241.0 | 34.665 |
| 1240.0 | 35.391 |
| 1239.0 | 36.423 |
| 1238.0 | 37.631 |
| 1237.0 | 38.949 |
| 1236.0 | 40.249 |
| 1235.0 | 41.3 |
| 1234.0 | 41.958 |
| 1233.0 | 42.146 |
| 1232.0 | 41.829 |
| 1231.0 | 41.122 |
| 1230.0 | 40.181 |
| 1229.0 | 39.167 |
| 1228.0 | 38.256 |
| 1227.0 | 37.57 |
| 1226.0 | 37.167 |
| 1225.0 | 37.085 |
| 1224.0 | 37.35 |
| 1223.0 | 37.94 |
| 1222.0 | 38.83 |
| 1221.0 | 39.864 |
| 1220.0 | 40.958 |
| 1219.0 | 41.97 |
| 1218.0 | 42.773 |
| 1217.0 | 43.289 |
| 1216.0 | 43.464 |
| 1215.0 | 43.326 |
| 1214.0 | 42.922 |
| 1213.0 | 42.37 |
| 1212.0 | 41.803 |
| 1211.0 | 41.337 |
| 1210.0 | 41.05 |
| 1209.0 | 40.989 |
| 1208.0 | 41.186 |
| 1207.0 | 41.575 |
| 1206.0 | 42.117 |
| 1205.0 | 42.776 |
| 1204.0 | 43.418 |
| 1203.0 | 43.908 |
| 1202.0 | 44.161 |
| 1201.0 | 44.112 |
| 1200.0 | 43.789 |
| 1199.0 | 43.289 |
| 1198.0 | 42.642 |
| 1197.0 | 42.037 |
| 1196.0 | 41.578 |
| 1195.0 | 41.318 |
| 1194.0 | 41.297 |
| 1193.0 | 41.519 |
| 1192.0 | 41.936 |
| 1191.0 | 42.457 |
| 1190.0 | 42.974 |
| 1189.0 | 43.359 |
| 1188.0 | 43.481 |
| 1187.0 | 43.266 |
| 1186.0 | 42.726 |
| 1185.0 | 41.923 |
| 1184.0 | 40.97 |
| 1183.0 | 39.971 |
| 1182.0 | 39.06 |
| 1181.0 | 38.354 |
| 1180.0 | 37.883 |
| 1179.0 | 37.708 |
| 1178.0 | 37.822 |
| 1177.0 | 38.186 |
| 1176.0 | 38.748 |
| 1175.0 | 39.4 |
| 1174.0 | 40.08 |
| 1173.0 | 40.63 |
| 1172.0 | 40.987 |
| 1171.0 | 41.085 |
| 1170.0 | 40.915 |
| 1169.0 | 40.518 |
| 1168.0 | 39.961 |
| 1167.0 | 39.377 |
| 1166.0 | 38.836 |
| 1165.0 | 38.408 |
| 1164.0 | 38.209 |
| 1163.0 | 38.233 |
| 1162.0 | 38.485 |
| 1161.0 | 38.914 |
| 1160.0 | 39.491 |
| 1159.0 | 40.14 |
| 1158.0 | 40.755 |
| 1157.0 | 41.269 |
| 1156.0 | 41.659 |
| 1155.0 | 41.934 |
| 1154.0 | 42.098 |
| 1153.0 | 42.18 |
| 1152.0 | 42.217 |
| 1151.0 | 42.255 |
| 1150.0 | 42.316 |
| 1149.0 | 42.43 |
| 1148.0 | 42.569 |
| 1147.0 | 42.678 |
| 1146.0 | 42.754 |
| 1145.0 | 42.797 |
| 1144.0 | 42.774 |
| 1143.0 | 42.678 |
| 1142.0 | 42.548 |
| 1141.0 | 42.433 |
| 1140.0 | 42.339 |
| 1139.0 | 42.297 |
| 1138.0 | 42.332 |
| 1137.0 | 42.439 |
| 1136.0 | 42.563 |
| 1135.0 | 42.7 |
| 1134.0 | 42.706 |
| 1133.0 | 42.556 |
| 1132.0 | 42.305 |
| 1131.0 | 41.984 |
| 1130.0 | 41.598 |
| 1129.0 | 41.145 |
| 1128.0 | 40.607 |
| 1127.0 | 40.186 |
| 1126.0 | 39.95 |
| 1125.0 | 39.89 |
| 1124.0 | 39.963 |
| 1123.0 | 40.254 |
| 1122.0 | 40.682 |
| 1121.0 | 41.103 |
| 1120.0 | 41.425 |
| 1119.0 | 41.579 |
| 1118.0 | 41.536 |
| 1117.0 | 41.253 |
| 1116.0 | 40.79 |
| 1115.0 | 40.255 |
| 1114.0 | 39.731 |
| 1113.0 | 39.362 |
| 1112.0 | 39.188 |
| 1111.0 | 39.252 |
| 1110.0 | 39.566 |
| 1109.0 | 40.05 |
| 1108.0 | 40.687 |
| 1107.0 | 41.338 |
| 1106.0 | 42 |
| 1105.0 | 42.525 |
| 1104.0 | 42.877 |
| 1103.0 | 43.059 |
| 1102.0 | 43.077 |
| 1101.0 | 43.016 |
| 1100.0 | 42.93 |
| 1099.0 | 42.858 |
| 1098.0 | 42.87 |
| 1097.0 | 42.975 |
| 1096.0 | 43.127 |
| 1095.0 | 43.315 |
| 1094.0 | 43.478 |
| 1093.0 | 43.609 |
| 1092.0 | 43.651 |
| 1091.0 | 43.647 |
| 1090.0 | 43.641 |
| 1089.0 | 43.638 |
| 1088.0 | 43.65 |
| 1087.0 | 43.696 |
| 1086.0 | 43.777 |
| 1085.0 | 43.875 |
| 1084.0 | 43.983 |
| 1083.0 | 44.011 |
| 1082.0 | 43.92 |
| 1081.0 | 43.749 |
| 1080.0 | 43.495 |
| 1079.0 | 43.146 |
| 1078.0 | 42.872 |
| 1077.0 | 42.697 |
| 1076.0 | 42.625 |
| 1075.0 | 42.661 |
| 1074.0 | 42.743 |
| 1073.0 | 42.754 |
| 1072.0 | 42.628 |
| 1071.0 | 42.358 |
| 1070.0 | 41.853 |
| 1069.0 | 41.219 |
| 1068.0 | 40.507 |
| 1067.0 | 39.902 |
| 1066.0 | 39.439 |
| 1065.0 | 39.276 |
| 1064.0 | 39.409 |
| 1063.0 | 39.803 |
| 1062.0 | 40.385 |
| 1061.0 | 40.982 |
| 1060.0 | 41.465 |
| 1059.0 | 41.697 |
| 1058.0 | 41.579 |
| 1057.0 | 41.134 |
| 1056.0 | 40.449 |
| 1055.0 | 39.696 |
| 1054.0 | 39.112 |
| 1053.0 | 38.817 |
| 1052.0 | 38.912 |
| 1051.0 | 39.402 |
| 1050.0 | 40.239 |
| 1049.0 | 41.286 |
| 1048.0 | 42.475 |
| 1047.0 | 43.402 |
| 1046.0 | 44.037 |
| 1045.0 | 44.205 |
| 1044.0 | 43.973 |
| 1043.0 | 43.484 |
| 1042.0 | 42.982 |
| 1041.0 | 42.731 |
| 1040.0 | 42.847 |
| 1039.0 | 43.382 |
| 1038.0 | 44.349 |
| 1037.0 | 45.547 |
| 1036.0 | 46.784 |
| 1035.0 | 47.749 |
| 1034.0 | 48.43 |
| 1033.0 | 48.646 |
| 1032.0 | 48.508 |
| 1031.0 | 48.125 |
| 1030.0 | 47.681 |
| 1029.0 | 47.297 |
| 1028.0 | 47.073 |
| 1027.0 | 46.952 |
| 1026.0 | 46.849 |
| 1025.0 | 46.678 |
| 1024.0 | 46.418 |
| 1023.0 | 46.144 |
| 1022.0 | 45.948 |
| 1021.0 | 45.877 |
| 1020.0 | 46.025 |
| 1019.0 | 46.351 |
| 1018.0 | 46.746 |
| 1017.0 | 46.989 |
| 1016.0 | 46.864 |
| 1015.0 | 46.161 |
| 1014.0 | 44.779 |
| 1013.0 | 42.904 |
| 1012.0 | 40.979 |
| 1011.0 | 39.188 |
| 1010.0 | 37.887 |
| 1009.0 | 37.248 |
| 1008.0 | 37.385 |
| 1007.0 | 38.293 |
| 1006.0 | 39.88 |
| 1005.0 | 41.948 |
| 1004.0 | 44.103 |
| 1003.0 | 45.851 |
| 1002.0 | 46.792 |
| 1001.0 | 46.816 |
| 1000.0 | 46.167 |
| 999.0 | 45.414 |
| 998.0 | 44.983 |
| 997.0 | 45.197 |
| 996.0 | 46.197 |
| 995.0 | 47.937 |
| 994.0 | 50.147 |
| 993.0 | 52.318 |
| 992.0 | 54.18 |
| 991.0 | 55.202 |
| 990.0 | 55.644 |
| 989.0 | 55.691 |
| 988.0 | 55.736 |
| 987.0 | 56.061 |
| 986.0 | 56.648 |
| 985.0 | 57.21 |
| 984.0 | 57.388 |
| 983.0 | 56.914 |
| 982.0 | 55.587 |
| 981.0 | 53.59 |
| 980.0 | 51.435 |
| 979.0 | 49.437 |
| 978.0 | 47.902 |
| 977.0 | 46.953 |
| 976.0 | 46.482 |
| 975.0 | 46.351 |
| 974.0 | 46.213 |
| 973.0 | 45.844 |
| 972.0 | 45.232 |
| 971.0 | 44.489 |
| 970.0 | 43.791 |
| 969.0 | 43.446 |
| 968.0 | 43.632 |
| 967.0 | 44.26 |
| 966.0 | 45.02 |
| 965.0 | 45.324 |
| 964.0 | 44.723 |
| 963.0 | 43.037 |
| 962.0 | 40.503 |
| 961.0 | 37.756 |
| 960.0 | 35.409 |
| 959.0 | 34.274 |
| 958.0 | 34.479 |
| 957.0 | 36.21 |
| 956.0 | 39.176 |
| 955.0 | 42.82 |
| 954.0 | 46.223 |
| 953.0 | 47.895 |
| 952.0 | 47.346 |
| 951.0 | 45.138 |
| 950.0 | 42.259 |
| 949.0 | 40.061 |
| 948.0 | 39.37 |
| 947.0 | 40.729 |
| 946.0 | 44.075 |
| 945.0 | 49.127 |
| 944.0 | 54.684 |
| 943.0 | 58.985 |
| 942.0 | 61.165 |
| 941.0 | 60.882 |
| 940.0 | 59.172 |
| 939.0 | 57.344 |
| 938.0 | 56.672 |
| 937.0 | 57.818 |
| 936.0 | 60.578 |
| 935.0 | 64.289 |
| 934.0 | 67.649 |
| 933.0 | 69.646 |
| 932.0 | 69.966 |
| 931.0 | 68.805 |
| 930.0 | 67.191 |
| 929.0 | 66.209 |
| 928.0 | 66.39 |
| 927.0 | 67.678 |
| 926.0 | 69.264 |
| 925.0 | 70.114 |
| 924.0 | 69.484 |
| 923.0 | 67.196 |
| 922.0 | 64.151 |
| 921.0 | 61.265 |
| 920.0 | 59.23 |
| 919.0 | 58.664 |
| 918.0 | 59.238 |
| 917.0 | 60.33 |
| 916.0 | 61.084 |
| 915.0 | 61.09 |
| 914.0 | 60.373 |
| 913.0 | 59.387 |
| 912.0 | 58.837 |
| 911.0 | 59.33 |
| 910.0 | 61.019 |
| 909.0 | 63.594 |
| 908.0 | 66.61 |
| 907.0 | 69.469 |
| 906.0 | 71.617 |
| 905.0 | 73.1 |
| 904.0 | 74.31 |
| 903.0 | 75.542 |
| 902.0 | 76.81 |
| 901.0 | 78.028 |
| 900.0 | 78.931 |
| 899.0 | 79.287 |
| 898.0 | 79.114 |
| 897.0 | 78.659 |
| 896.0 | 78.283 |
| 895.0 | 78.165 |
| 894.0 | 78.189 |
| 893.0 | 77.991 |
| 892.0 | 77.148 |
| 891.0 | 75.375 |
| 890.0 | 72.819 |
| 889.0 | 69.999 |
| 888.0 | 67.63 |
| 887.0 | 66.155 |
| 886.0 | 65.589 |
| 885.0 | 65.598 |
| 884.0 | 65.467 |
| 883.0 | 64.657 |
| 882.0 | 63.118 |
| 881.0 | 60.978 |
| 880.0 | 58.784 |
| 879.0 | 57.389 |
| 878.0 | 57.131 |
| 877.0 | 57.957 |
| 876.0 | 59.463 |
| 875.0 | 61.087 |
| 874.0 | 62.343 |
| 873.0 | 63.099 |
| 872.0 | 63.692 |
| 871.0 | 64.569 |
| 870.0 | 66.034 |
| 869.0 | 68.193 |
| 868.0 | 70.774 |
| 867.0 | 73.413 |
| 866.0 | 76.007 |
| 865.0 | 78.185 |
| 864.0 | 79.813 |
| 863.0 | 81.156 |
| 862.0 | 82.245 |
| 861.0 | 83.145 |
| 860.0 | 84.698 |
| 859.0 | 87.732 |
| 858.0 | 90.12 |
| 857.0 | 89.5 |
| 856.0 | 86.507 |
| 855.0 | 83.057 |
| 854.0 | 80.623 |
| 853.0 | 79.197 |
| 852.0 | 77.739 |
| 851.0 | 74.807 |
| 850.0 | 69.696 |
| 849.0 | 63.19 |
| 848.0 | 56.729 |
| 847.0 | 51.429 |
| 846.0 | 47.881 |
| 845.0 | 45.929 |
| 844.0 | 44.997 |
| 843.0 | 44.598 |
| 842.0 | 44.39 |
| 841.0 | 44.16 |
| 840.0 | 43.83 |
| 839.0 | 43.448 |
| 838.0 | 42.987 |
| 837.0 | 42.402 |
| 836.0 | 41.764 |
| 835.0 | 41.192 |
| 834.0 | 40.946 |
| 833.0 | 41.222 |
| 832.0 | 41.982 |
| 831.0 | 43.103 |
| 830.0 | 44.207 |
| 829.0 | 44.873 |
| 828.0 | 44.988 |
| 827.0 | 44.8 |
| 826.0 | 44.885 |
| 825.0 | 45.863 |
| 824.0 | 47.957 |
| 823.0 | 50.948 |
| 822.0 | 54.327 |
| 821.0 | 57.336 |
| 820.0 | 59.431 |
| 819.0 | 60.805 |
| 818.0 | 62.232 |
| 817.0 | 64.614 |
| 816.0 | 68.561 |
| 815.0 | 74.044 |
| 814.0 | 80.071 |
| 813.0 | 85.421 |
| 812.0 | 89.093 |
| 811.0 | 90.754 |
| 810.0 | 91.04 |
| 809.0 | 90.879 |
| 808.0 | 91.048 |
| 807.0 | 91.849 |
| 806.0 | 93.114 |
| 805.0 | 94.516 |
| 804.0 | 95.922 |
| 803.0 | 97.105 |
| 802.0 | 97.992 |
| 801.0 | 98.684 |
| 800.0 | 99.094 |
| 799.0 | 99.229 |
| 798.0 | 99.302 |
| 797.0 | 99.283 |
| 796.0 | 99.152 |
| 795.0 | 99.068 |
| 794.0 | 98.971 |
| 793.0 | 98.908 |
| 792.0 | 98.912 |
| 791.0 | 98.969 |
| 790.0 | 98.986 |
| 789.0 | 99.034 |
| 788.0 | 98.999 |
| 787.0 | 98.842 |
| 786.0 | 98.676 |
| 785.0 | 98.5 |
| 784.0 | 98.341 |
| 783.0 | 98.409 |
| 782.0 | 98.616 |
| 781.0 | 98.853 |
| 780.0 | 99.093 |
| 779.0 | 99.133 |
| 778.0 | 98.899 |
| 777.0 | 98.702 |
| 776.0 | 98.626 |
| 775.0 | 98.65 |
| 774.0 | 98.847 |
| 773.0 | 99.074 |
| 772.0 | 99.148 |
| 771.0 | 99.156 |
| 770.0 | 99.055 |
| 769.0 | 98.894 |
| 768.0 | 98.91 |
| 767.0 | 99.019 |
| 766.0 | 99.132 |
| 765.0 | 99.252 |
| 764.0 | 99.195 |
| 763.0 | 98.924 |
| 762.0 | 98.568 |
| 761.0 | 98.245 |
| 760.0 | 98.047 |
| 759.0 | 98.262 |
| 758.0 | 98.658 |
| 757.0 | 98.929 |
| 756.0 | 99.015 |
| 755.0 | 98.824 |
| 754.0 | 98.491 |
| 753.0 | 98.456 |
| 752.0 | 98.617 |
| 751.0 | 98.886 |
| 750.0 | 99.161 |
| 749.0 | 99.237 |
| 748.0 | 99.003 |
| 747.0 | 98.846 |
| 746.0 | 98.727 |
| 745.0 | 98.701 |
| 744.0 | 98.887 |
| 743.0 | 99.088 |
| 742.0 | 99.198 |
| 741.0 | 99.222 |
| 740.0 | 98.939 |
| 739.0 | 98.446 |
| 738.0 | 98.141 |
| 737.0 | 98.176 |
| 736.0 | 98.494 |
| 735.0 | 98.998 |
| 734.0 | 99.287 |
| 733.0 | 99.277 |
| 732.0 | 99.25 |
| 731.0 | 99.261 |
| 730.0 | 99.184 |
| 729.0 | 99.104 |
| 728.0 | 98.865 |
| 727.0 | 98.631 |
| 726.0 | 98.753 |
| 725.0 | 99.092 |
| 724.0 | 99.263 |
| 723.0 | 99.306 |
| 722.0 | 99.138 |
| 721.0 | 99.036 |
| 720.0 | 99.207 |
| 719.0 | 99.356 |
| 718.0 | 99.225 |
| 717.0 | 99.017 |
| 716.0 | 98.927 |
| 715.0 | 99.016 |
| 714.0 | 99.295 |
| 713.0 | 99.345 |
| 712.0 | 99.133 |
| 711.0 | 99.088 |
| 710.0 | 99.183 |
| 709.0 | 99.32 |
| 708.0 | 99.367 |
| 707.0 | 99.191 |
| 706.0 | 99.007 |
| 705.0 | 99.175 |
| 704.0 | 99.427 |
| 703.0 | 99.35 |
| 702.0 | 99.185 |
| 701.0 | 99.086 |
| 700.0 | 99.109 |
| 699.0 | 99.367 |
| 698.0 | 99.428 |
| 697.0 | 99.284 |
| 696.0 | 99.278 |
| 695.0 | 99.357 |
| 694.0 | 99.342 |
| 693.0 | 99.292 |
| 692.0 | 99.212 |
| 691.0 | 99.144 |
| 690.0 | 99.325 |
| 689.0 | 99.328 |
| 688.0 | 99.076 |
| 687.0 | 99.046 |
| 686.0 | 99.184 |
| 685.0 | 99.265 |
| 684.0 | 99.109 |
| 683.0 | 98.85 |
| 682.0 | 98.768 |
| 681.0 | 99.128 |
| 680.0 | 99.305 |
| 679.0 | 99.125 |
| 678.0 | 99.039 |
| 677.0 | 99.111 |
| 676.0 | 99.217 |
| 675.0 | 99.279 |
| 674.0 | 99.122 |
| 673.0 | 99.074 |
| 672.0 | 99.256 |
| 671.0 | 99.129 |
| 670.0 | 98.673 |
| 669.0 | 98.515 |
| 668.0 | 98.81 |
| 667.0 | 99.182 |
| 666.0 | 99.153 |
| 665.0 | 98.916 |
| 664.0 | 98.901 |
| 663.0 | 99.152 |
| 662.0 | 99.161 |
| 661.0 | 98.887 |
| 660.0 | 98.889 |
| 659.0 | 99.091 |
| 658.0 | 99.089 |
| 657.0 | 98.927 |
| 656.0 | 98.824 |
| 655.0 | 98.936 |
| 654.0 | 99.148 |
| 653.0 | 99.073 |
| 652.0 | 98.917 |
| 651.0 | 99.131 |
| 650.0 | 98.027 |
| 649.0 | 98.291 |
| 648.0 | 98.387 |
| 647.0 | 98.238 |
| 646.0 | 98.172 |
| 645.0 | 97.662 |
| 644.0 | 99.264 |
| 643.0 | 98.648 |
| 642.0 | 98.354 |
| 641.0 | 98.933 |
| 640.0 | 97.819 |
| 639.0 | 98.512 |
| 638.0 | 98.324 |
| 637.0 | 97.725 |
| 636.0 | 98.707 |
| 635.0 | 98.885 |
| 634.0 | 97.338 |
| 633.0 | 97.717 |
| 632.0 | 98.321 |
| 631.0 | 98.033 |
| 630.0 | 97.837 |
| 629.0 | 98.107 |
| 628.0 | 98.622 |
| 627.0 | 99.086 |
| 626.0 | 98.635 |
| 625.0 | 98.578 |
| 624.0 | 98.927 |
| 623.0 | 98.234 |
| 622.0 | 98.398 |
| 621.0 | 98.95 |
| 620.0 | 98.604 |
| 619.0 | 98.155 |
| 618.0 | 97.785 |
| 617.0 | 98.596 |
| 616.0 | 98.002 |
| 615.0 | 97.075 |
| 614.0 | 97.744 |
| 613.0 | 98.996 |
| 612.0 | 98.681 |
| 611.0 | 98.469 |
| 610.0 | 98.29 |
| 609.0 | 98.484 |
| 608.0 | 98.5 |
| 607.0 | 98.129 |
| 606.0 | 98.794 |
| 605.0 | 98.472 |
| 604.0 | 97.307 |
| 603.0 | 98.76 |
| 602.0 | 98.678 |
| 601.0 | 98.113 |
| 600.0 | 98.66 |
| 599.0 | 98.892 |
| 598.0 | 97.684 |
| 597.0 | 97.944 |
| 596.0 | 98.704 |
| 595.0 | 98.692 |
| 594.0 | 98.411 |
| 593.0 | 98.433 |
| 592.0 | 99.071 |
| 591.0 | 97.945 |
| 590.0 | 97.879 |
| 589.0 | 98.744 |
| 588.0 | 98.021 |
| 587.0 | 97.929 |
| 586.0 | 99.048 |
| 585.0 | 98.043 |
| 584.0 | 98.047 |
| 583.0 | 98.524 |
| 582.0 | 98.598 |
| 581.0 | 98.077 |
| 580.0 | 98.349 |
| 579.0 | 99.057 |
| 578.0 | 98.657 |
| 577.0 | 99.03 |
| 576.0 | 99.214 |
| 575.0 | 98.274 |
| 574.0 | 98.344 |
| 573.0 | 98.615 |
| 572.0 | 98.154 |
| 571.0 | 98.074 |
| 570.0 | 98.705 |
| 569.0 | 98.115 |
| 568.0 | 98.493 |
| 567.0 | 98.409 |
| 566.0 | 98.284 |
| 565.0 | 98.771 |
| 564.0 | 98.546 |
| 563.0 | 97.538 |
| 562.0 | 98.358 |
| 561.0 | 98.812 |
| 560.0 | 98.286 |
| 559.0 | 98.301 |
| 558.0 | 98.078 |
| 557.0 | 97.142 |
| 556.0 | 98.232 |
| 555.0 | 98.584 |
| 554.0 | 98.043 |
| 553.0 | 98.498 |
| 552.0 | 98.191 |
| 551.0 | 97.773 |
| 550.0 | 98.851 |
| 549.0 | 97.751 |
| 548.0 | 97.874 |
| 547.0 | 98.106 |
| 546.0 | 96.883 |
| 545.0 | 97.576 |
| 544.0 | 97.975 |
| 543.0 | 96.93 |
| 542.0 | 98.052 |
| 541.0 | 97.56 |
| 540.0 | 96.79 |
| 539.0 | 97.876 |
| 538.0 | 96.984 |
| 537.0 | 97.507 |
| 536.0 | 97.656 |
| 535.0 | 96.31 |
| 534.0 | 97.782 |
| 533.0 | 97.087 |
| 532.0 | 96.04 |
| 531.0 | 97.499 |
| 530.0 | 96.492 |
| 529.0 | 97.15 |
| 528.0 | 96.865 |
| 527.0 | 96.302 |
| 526.0 | 97.081 |
| 525.0 | 95.361 |
| 524.0 | 96.139 |
| 523.0 | 95.388 |
| 522.0 | 95.357 |
| 521.0 | 96.205 |
| 520.0 | 94.362 |
| 519.0 | 95.469 |
| 518.0 | 94.831 |
| 517.0 | 95.184 |
| 516.0 | 95.508 |
| 515.0 | 94.332 |
| 514.0 | 95.937 |
| 513.0 | 94.26 |
| 512.0 | 95.053 |
| 511.0 | 94.636 |
| 510.0 | 94.67 |
| 509.0 | 97.068 |
| 508.0 | 96.775 |
| 507.0 | 96.923 |
| 506.0 | 96.063 |
| 505.0 | 96.258 |
| 504.0 | 95.75 |
| 503.0 | 96.38 |
| 502.0 | 95.228 |
| 501.0 | 94.768 |
| 500.0 | 92.368 |
| 499.0 | 89.922 |
| 498.0 | 83.678 |
| 497.0 | 15.372 |
| 496.0 | 9.764 |
| 495.0 | 2.897 |
| 494.0 | 0.062 |
| 493.0 | 0.006 |
| 492.0 | 0.001 |
| 491.0 | 0 |
| 490.0 | 0 |
| 489.0 | 0 |
| 488.0 | 0 |
| 487.0 | 0.001 |
| 486.0 | 0.004 |
| 485.0 | 0.031 |
| 484.0 | 1.319 |
| 483.0 | 8.592 |
| 482.0 | 81.67 |
| 481.0 | 95.395 |
| 480.0 | 95.83 |
| 479.0 | 96.431 |
| 478.0 | 96.673 |
| 477.0 | 96.996 |
| 476.0 | 97.621 |
| 475.0 | 97.596 |
| 474.0 | 97.667 |
| 473.0 | 97.525 |
| 472.0 | 97.761 |
| 471.0 | 97.52 |
| 470.0 | 97.089 |
| 469.0 | 97.293 |
| 468.0 | 96.316 |
| 467.0 | 95.469 |
| 466.0 | 95.502 |
| 465.0 | 95.877 |
| 464.0 | 96.129 |
| 463.0 | 96.364 |
| 462.0 | 96.418 |
| 461.0 | 95.845 |
| 460.0 | 96.178 |
| 459.0 | 96.222 |
| 458.0 | 96.473 |
| 457.0 | 96.144 |
| 456.0 | 96.192 |
| 455.0 | 96.195 |
| 454.0 | 96.206 |
| 453.0 | 97.056 |
| 452.0 | 97.111 |
| 451.0 | 97.219 |
| 450.0 | 97.22 |
| 449.0 | 96.993 |
| 448.0 | 97.097 |
| 447.0 | 96.803 |
| 446.0 | 96.946 |
| 445.0 | 97.19 |
| 444.0 | 96.86 |
| 443.0 | 96.925 |
| 442.0 | 97.204 |
| 441.0 | 97.283 |
| 440.0 | 97.267 |
| 439.0 | 97.189 |
| 438.0 | 96.709 |
| 437.0 | 96.518 |
| 436.0 | 96.778 |
| 435.0 | 97.077 |
| 434.0 | 97.218 |
| 433.0 | 97.202 |
| 432.0 | 96.687 |
| 431.0 | 96.777 |
| 430.0 | 97.07 |
| 429.0 | 97.061 |
| 428.0 | 97.04 |
| 427.0 | 96.996 |
| 426.0 | 96.96 |
| 425.0 | 97.005 |
| 424.0 | 97.305 |
| 423.0 | 97.269 |
| 422.0 | 97.058 |
| 421.0 | 97.062 |
| 420.0 | 96.767 |
| 419.0 | 97.1 |
| 418.0 | 96.919 |
| 417.0 | 96.869 |
| 416.0 | 97.227 |
| 415.0 | 96.649 |
| 414.0 | 96.128 |
| 413.0 | 96.38 |
| 412.0 | 96.632 |
| 411.0 | 96.859 |
| 410.0 | 96.555 |
| 409.0 | 96.251 |
| 408.0 | 96.139 |
| 407.0 | 96.08 |
| 406.0 | 96.073 |
| 405.0 | 95.723 |
| 404.0 | 95.5 |
| 403.0 | 95.248 |
| 402.0 | 95.179 |
| 401.0 | 95.265 |
| 400.0 | 94.87 |
| 399.0 | 94.928 |
| 398.0 | 94.679 |
| 397.0 | 94.536 |
| 396.0 | 94.165 |
| 395.0 | 93.694 |
| 394.0 | 93.356 |
| 393.0 | 92.931 |
| 392.0 | 91.647 |
| 391.0 | 89.104 |
| 390.0 | 86.503 |
| 389.0 | 84.326 |
| 388.0 | 80.629 |
| 387.0 | 74.706 |
| 386.0 | 68.509 |
| 385.0 | 62.437 |
| 384.0 | 56.644 |
| 383.0 | 50.675 |
| 382.0 | 42.434 |
| 381.0 | 34.114 |
| 380.0 | 29.535 |
| 379.0 | 26.579 |
| 378.0 | 22.825 |
| 377.0 | 21.423 |
| 376.0 | 20.396 |
| 375.0 | 16.125 |
| 374.0 | 11.362 |
| 373.0 | 9.264 |
| 372.0 | 8.09 |
| 371.0 | 5.894 |
| 370.0 | 3.856 |
| 369.0 | 2.723 |
| 368.0 | 1.848 |
| 367.0 | 1.211 |
| 366.0 | 0.894 |
| 365.0 | 0.602 |
| 364.0 | 0.336 |
| 363.0 | 0.179 |
| 362.0 | 0.09 |
| 361.0 | 0.043 |
| 360.0 | 0.018 |
| 359.0 | 0.003 |
| 358.0 | 0.003 |
| 357.0 | 0.002 |
| 356.0 | 0.004 |
| 355.0 | 0.001 |
| 354.0 | 0 |
| 353.0 | 0.003 |
| 352.0 | 0.004 |
| 351.0 | 0.002 |
| 350.0 | 0.004 |
| 349.0 | 0.001 |
| 348.0 | 0 |
| 347.0 | 0.003 |
| 346.0 | 0.005 |
| 345.0 | 0.002 |
| 344.0 | 0.004 |
| 343.0 | 0.002 |
| 342.0 | 0.001 |
| 341.0 | 0.003 |
| 340.0 | 0.005 |
| 339.0 | 0.001 |
| 338.0 | 0.005 |
| 337.0 | 0 |
| 336.0 | 0.002 |
| 335.0 | 0.003 |
| 334.0 | 0.005 |
| 333.0 | 0.004 |
| 332.0 | 0.005 |
| 331.0 | 0.005 |
| 330.0 | 0.003 |
| 329.0 | 0.003 |
| 328.0 | 0.005 |
| 327.0 | 0.001 |
| 326.0 | 0.004 |
| 325.0 | 0 |
| 324.0 | 0.001 |
| 323.0 | 0.003 |
| 322.0 | 0.005 |
| 321.0 | 0.002 |
| 320.0 | 0.005 |
| 319.0 | 0 |
| 318.0 | 0.004 |
| 317.0 | 0.005 |
| 316.0 | 0.004 |
| 315.0 | 0.005 |
| 314.0 | 0.002 |
| 313.0 | 0 |
| 312.0 | 0.001 |
| 311.0 | 0.004 |
| 310.0 | 0.004 |
| 309.0 | 0.002 |
| 308.0 | 0.003 |
| 307.0 | 0 |
| 306.0 | 0 |
| 305.0 | 0.004 |
| 304.0 | 0.004 |
| 303.0 | 0.001 |
| 302.0 | 0.003 |
| 301.0 | 0.001 |
| 300.0 | 0 |
| 299.0 | 0.004 |
| 298.0 | 0.005 |
| 297.0 | 0.004 |
| 296.0 | 0.003 |
| 295.0 | 0 |
| 294.0 | 0 |
| 293.0 | 0.003 |
| 292.0 | 0.005 |
| 291.0 | 0.003 |
| 290.0 | 0.004 |
| 289.0 | 0 |
| 288.0 | 0.003 |
| 287.0 | 0.003 |
| 286.0 | 0.005 |
| 285.0 | 0.003 |
| 284.0 | 0.004 |
| 283.0 | 0 |
| 282.0 | 0.002 |
| 281.0 | 0.003 |
| 280.0 | 0.006 |
| 279.0 | 0 |
| 278.0 | 0.006 |
| 277.0 | 0.001 |
| 276.0 | 0.004 |
| 275.0 | 0.003 |
| 274.0 | 0.006 |
| 273.0 | 0.004 |
| 272.0 | 0.004 |
| 271.0 | 0 |
| 270.0 | 0.002 |
| 269.0 | 0.004 |
| 268.0 | 0.005 |
| 267.0 | 0 |
| 266.0 | 0.001 |
| 265.0 | 0.001 |
| 264.0 | 0.001 |
| 263.0 | 0.005 |
| 262.0 | 0.006 |
| 261.0 | 0.001 |
| 260.0 | 0.005 |
| 259.0 | 0 |
| 258.0 | 0.001 |
| 257.0 | 0.005 |
| 256.0 | 0.005 |
| 255.0 | 0.001 |
| 254.0 | 0.005 |
| 253.0 | 0.001 |
| 252.0 | 0.001 |
| 251.0 | 0.006 |
| 250.0 | 0.006 |
| 249.0 | 0.004 |
| 248.0 | 0.004 |
| 247.0 | 0.001 |
| 246.0 | 0 |
| 245.0 | 0.005 |
| 244.0 | 0.004 |
| 243.0 | 0.006 |
| 242.0 | 0.004 |
| 241.0 | 0.001 |
| 240.0 | 0 |
| 239.0 | 0.006 |
| 238.0 | 0.004 |
| 237.0 | 0.002 |
| 236.0 | 0.005 |
| 235.0 | 0.001 |
| 234.0 | 0.001 |
| 233.0 | 0.006 |
| 232.0 | 0.004 |
| 231.0 | 0.005 |
| 230.0 | 0.004 |
| 229.0 | 0.001 |
| 228.0 | 0.001 |
| 227.0 | 0.007 |
| 226.0 | 0.004 |
| 225.0 | 0.002 |
| 224.0 | 0.003 |
| 223.0 | 0.001 |
| 222.0 | 0.001 |
| 221.0 | 0.006 |
| 220.0 | 0.005 |
| 219.0 | 0.005 |
| 218.0 | 0.003 |
| 217.0 | 0.003 |
| 216.0 | 0.001 |
| 215.0 | 0.005 |
| 214.0 | 0.004 |
| 213.0 | 0.005 |
| 212.0 | 0.005 |
| 211.0 | 0.002 |
| 210.0 | 0.003 |
| 209.0 | 0.005 |
| 208.0 | 0.005 |
| 207.0 | 0.004 |
| 206.0 | 0.006 |
| 205.0 | 0.002 |
| 204.0 | 0.003 |
| 203.0 | 0.008 |
| 202.0 | 0.009 |
| 201.0 | 0.009 |